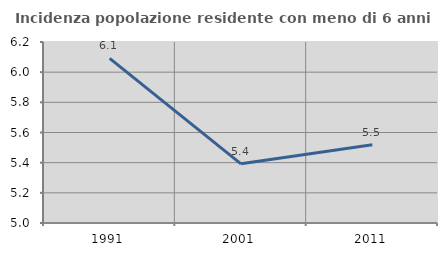
| Category | Incidenza popolazione residente con meno di 6 anni |
|---|---|
| 1991.0 | 6.092 |
| 2001.0 | 5.392 |
| 2011.0 | 5.518 |